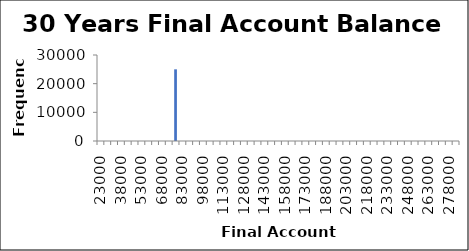
| Category | Frequency |
|---|---|
| 23000.0 | 0 |
| 28000.0 | 0 |
| 33000.0 | 0 |
| 38000.0 | 0 |
| 43000.0 | 0 |
| 48000.0 | 0 |
| 53000.0 | 0 |
| 58000.0 | 0 |
| 63000.0 | 0 |
| 68000.0 | 0 |
| 73000.0 | 0 |
| 78000.0 | 25000 |
| 83000.0 | 0 |
| 88000.0 | 0 |
| 93000.0 | 0 |
| 98000.0 | 0 |
| 103000.0 | 0 |
| 108000.0 | 0 |
| 113000.0 | 0 |
| 118000.0 | 0 |
| 123000.0 | 0 |
| 128000.0 | 0 |
| 133000.0 | 0 |
| 138000.0 | 0 |
| 143000.0 | 0 |
| 148000.0 | 0 |
| 153000.0 | 0 |
| 158000.0 | 0 |
| 163000.0 | 0 |
| 168000.0 | 0 |
| 173000.0 | 0 |
| 178000.0 | 0 |
| 183000.0 | 0 |
| 188000.0 | 0 |
| 193000.0 | 0 |
| 198000.0 | 0 |
| 203000.0 | 0 |
| 208000.0 | 0 |
| 213000.0 | 0 |
| 218000.0 | 0 |
| 223000.0 | 0 |
| 228000.0 | 0 |
| 233000.0 | 0 |
| 238000.0 | 0 |
| 243000.0 | 0 |
| 248000.0 | 0 |
| 253000.0 | 0 |
| 258000.0 | 0 |
| 263000.0 | 0 |
| 268000.0 | 0 |
| 273000.0 | 0 |
| 278000.0 | 0 |
| More | 0 |